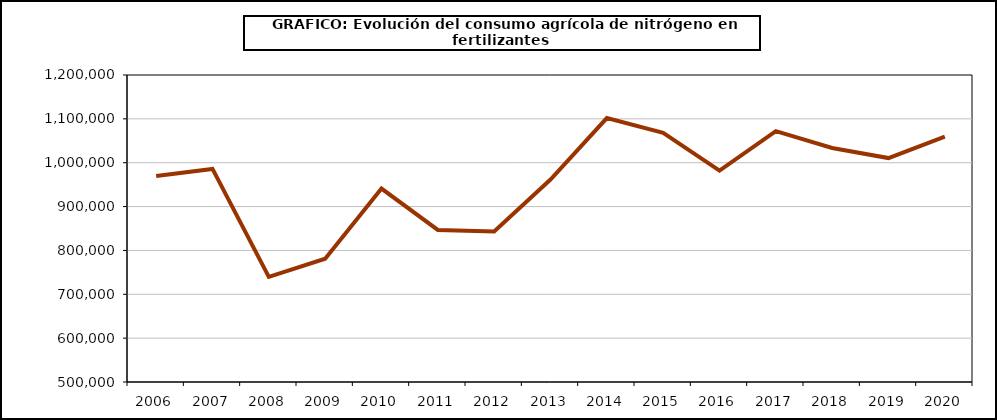
| Category | fertilizantes |
|---|---|
| 2006.0 | 969783 |
| 2007.0 | 985857 |
| 2008.0 | 739757 |
| 2009.0 | 781069 |
| 2010.0 | 940984 |
| 2011.0 | 846697 |
| 2012.0 | 843410 |
| 2013.0 | 961507 |
| 2014.0 | 1101895 |
| 2015.0 | 1068103 |
| 2016.0 | 982155 |
| 2017.0 | 1072125 |
| 2018.0 | 1033494 |
| 2019.0 | 1010579 |
| 2020.0 | 1059299 |